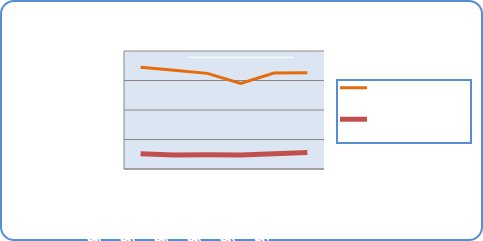
| Category | Motorin Türleri  | Benzin Türleri |
|---|---|---|
| 8/27/18 | 68975185.57 | 10396177.409 |
| 8/28/18 | 66924637.744 | 9503153.653 |
| 8/29/18 | 64839142.671 | 9585647.143 |
| 8/30/18 | 58089124.614 | 9459916.743 |
| 8/31/18 | 65038801.328 | 10317229.194 |
| 9/1/18 | 65323008.725 | 11220340.9 |